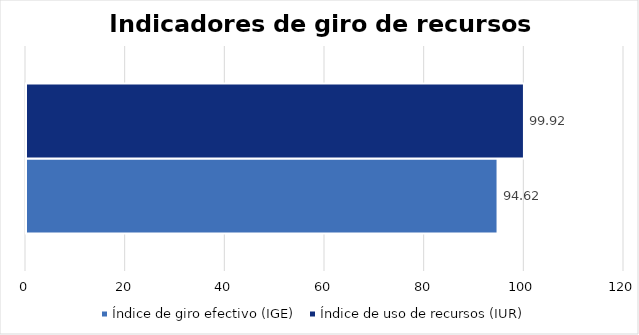
| Category | Índice de giro efectivo (IGE) | Índice de uso de recursos (IUR)  |
|---|---|---|
| Producto  | 94.625 | 99.922 |